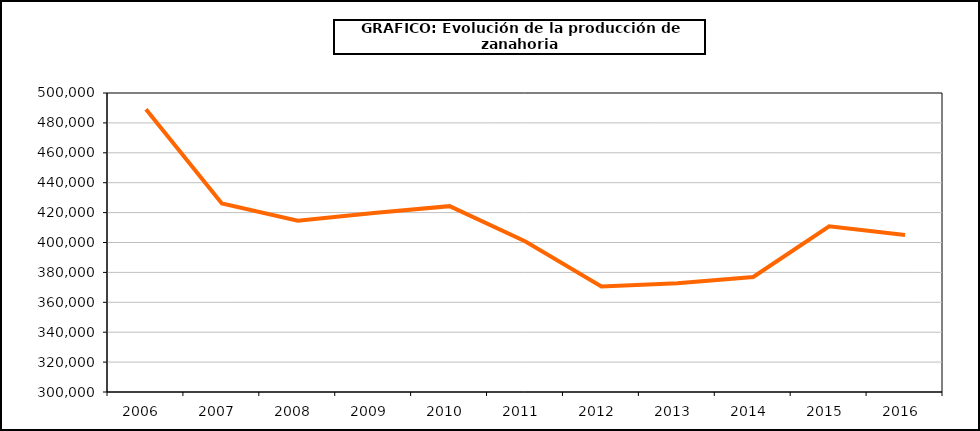
| Category | producción |
|---|---|
| 2006.0 | 489189 |
| 2007.0 | 426074 |
| 2008.0 | 414507 |
| 2009.0 | 419662 |
| 2010.0 | 424311 |
| 2011.0 | 400628 |
| 2012.0 | 370570 |
| 2013.0 | 372714 |
| 2014.0 | 376952 |
| 2015.0 | 410865 |
| 2016.0 | 404962 |